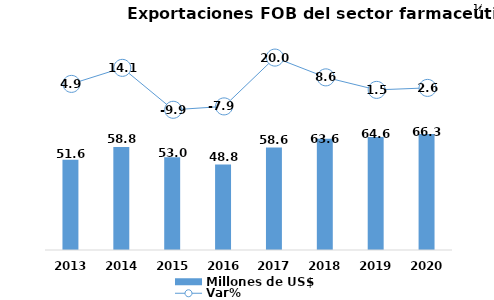
| Category | Millones de US$ |
|---|---|
| 2013.0 | 51.573 |
| 2014.0 | 58.838 |
| 2015.0 | 53.025 |
| 2016.0 | 48.815 |
| 2017.0 | 58.554 |
| 2018.0 | 63.617 |
| 2019.0 | 64.567 |
| 2020.0 | 66.268 |